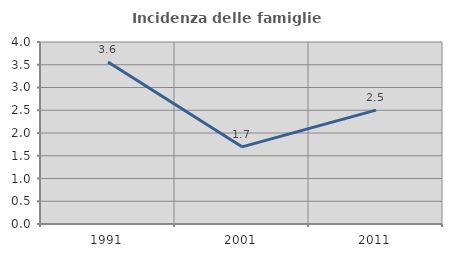
| Category | Incidenza delle famiglie numerose |
|---|---|
| 1991.0 | 3.562 |
| 2001.0 | 1.696 |
| 2011.0 | 2.502 |